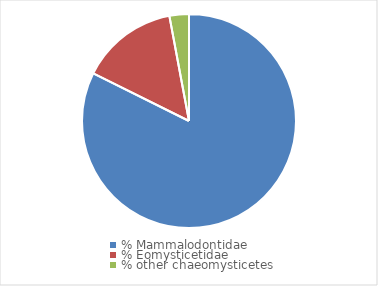
| Category | Series 0 |
|---|---|
| % Mammalodontidae | 0.824 |
| % Eomysticetidae | 0.147 |
| % other chaeomysticetes | 0.029 |